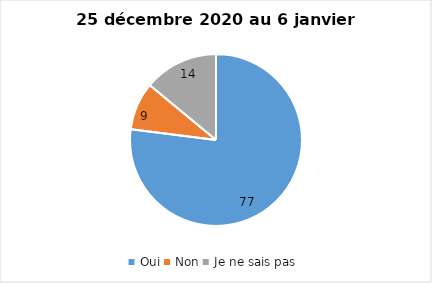
| Category | Series 0 |
|---|---|
| Oui | 77 |
| Non | 9 |
| Je ne sais pas | 14 |